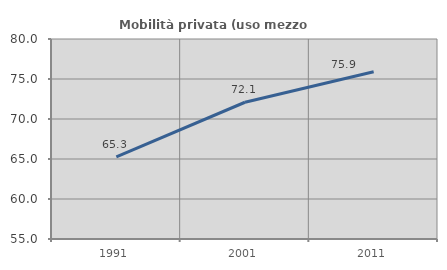
| Category | Mobilità privata (uso mezzo privato) |
|---|---|
| 1991.0 | 65.272 |
| 2001.0 | 72.093 |
| 2011.0 | 75.914 |